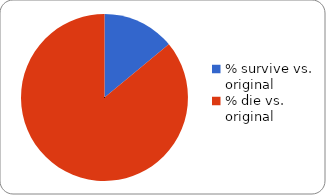
| Category | Series 0 |
|---|---|
| % survive vs. original | 0.14 |
| % die vs. original | 0.86 |